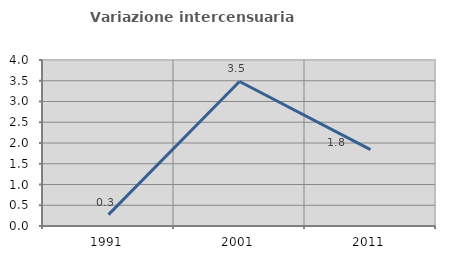
| Category | Variazione intercensuaria annua |
|---|---|
| 1991.0 | 0.275 |
| 2001.0 | 3.482 |
| 2011.0 | 1.842 |